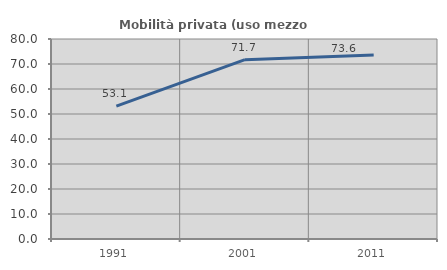
| Category | Mobilità privata (uso mezzo privato) |
|---|---|
| 1991.0 | 53.123 |
| 2001.0 | 71.742 |
| 2011.0 | 73.563 |